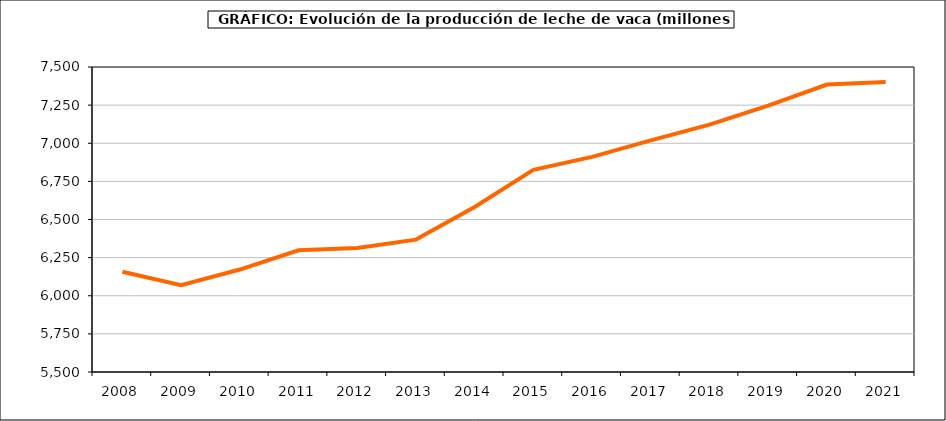
| Category | leche vaca |
|---|---|
| 2008.0 | 6157.188 |
| 2009.0 | 6069.364 |
| 2010.0 | 6171.9 |
| 2011.0 | 6298.47 |
| 2012.0 | 6313.014 |
| 2013.0 | 6368.131 |
| 2014.0 | 6582.284 |
| 2015.0 | 6825.141 |
| 2016.0 | 6910.608 |
| 2017.0 | 7018.786 |
| 2018.0 | 7121.965 |
| 2019.0 | 7246.416 |
| 2020.0 | 7384.533 |
| 2021.0 | 7401.056 |